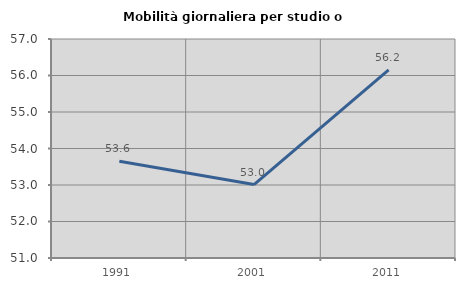
| Category | Mobilità giornaliera per studio o lavoro |
|---|---|
| 1991.0 | 53.648 |
| 2001.0 | 53.011 |
| 2011.0 | 56.155 |